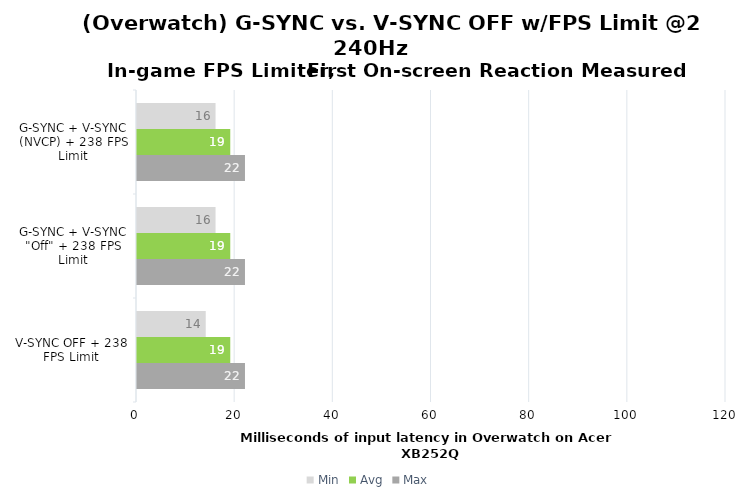
| Category | Min | Avg | Max |
|---|---|---|---|
| G-SYNC + V-SYNC (NVCP) + 238 FPS Limit | 16 | 19 | 22 |
| G-SYNC + V-SYNC "Off" + 238 FPS Limit | 16 | 19 | 22 |
| V-SYNC OFF + 238 FPS Limit | 14 | 19 | 22 |